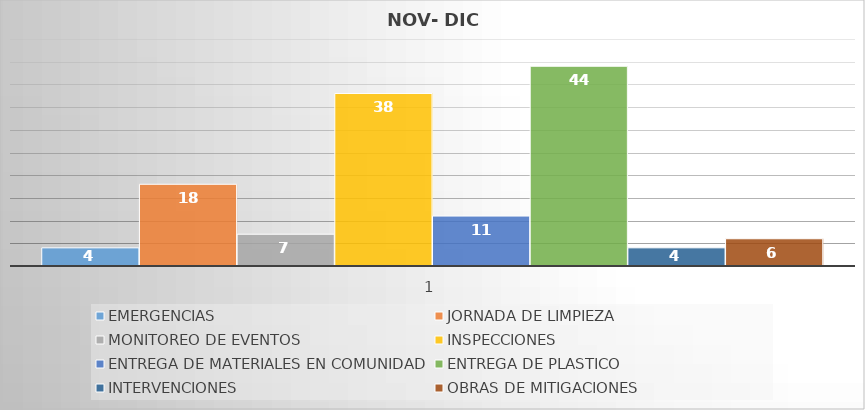
| Category | EMERGENCIAS  | JORNADA DE LIMPIEZA | MONITOREO DE EVENTOS  | INSPECCIONES | ENTREGA DE MATERIALES EN COMUNIDAD | ENTREGA DE PLASTICO | INTERVENCIONES | OBRAS DE MITIGACIONES |
|---|---|---|---|---|---|---|---|---|
| 0 | 4 | 18 | 7 | 38 | 11 | 44 | 4 | 6 |